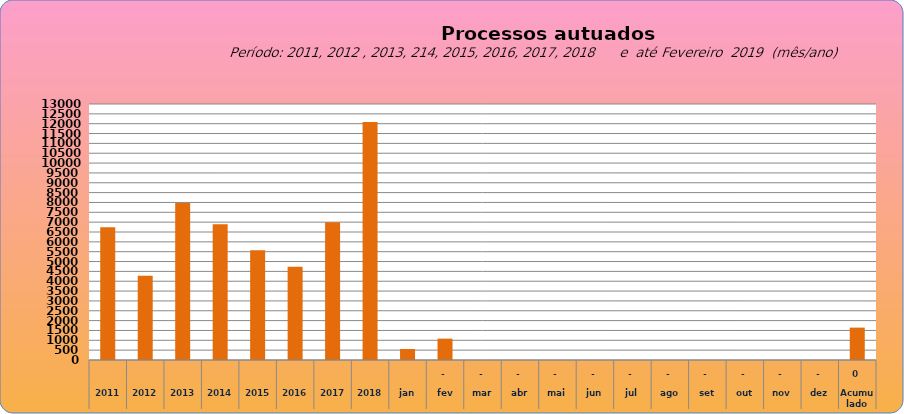
| Category | 6735 |
|---|---|
| 2011 | 6735 |
| 2012 | 4276 |
| 2013 | 7967 |
| 2014 | 6893 |
| 2015 | 5569 |
| 2016 | 4737 |
| 2017 | 6997 |
| 2018 | 12080 |
| jan | 560 |
| fev | 1085 |
| mar | 0 |
| abr | 0 |
| mai | 0 |
| jun | 0 |
| jul | 0 |
| ago | 0 |
| set | 0 |
| out | 0 |
| nov | 0 |
| dez | 0 |
| Acumulado
 | 1644 |